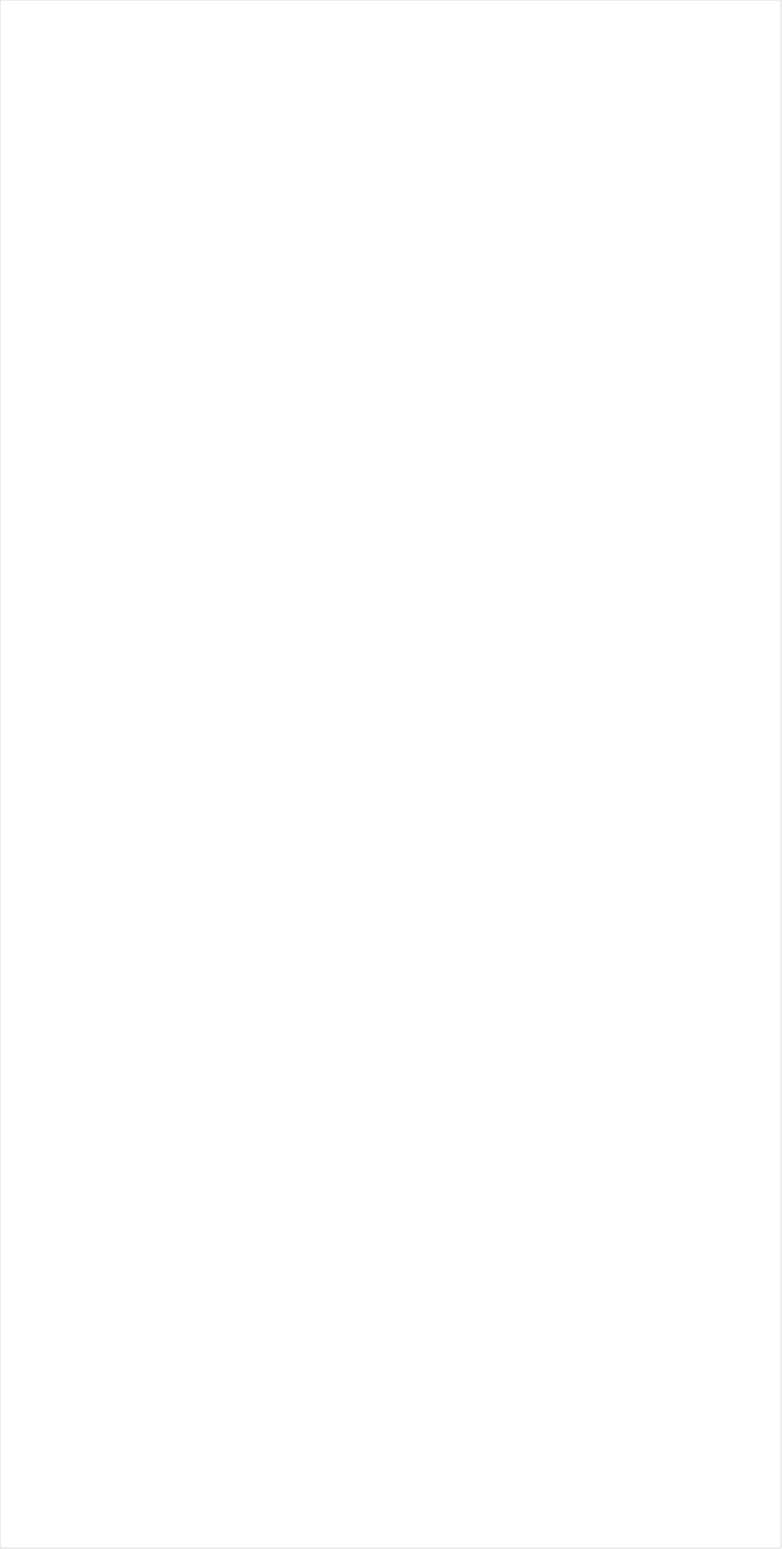
| Category | Total |
|---|---|
| INSP | -0.171 |
| PBS | -0.171 |
| RFD TV | -0.168 |
| Hallmark Movies & Mysteries | -0.166 |
| Tennis Channel | -0.152 |
| Fox Business | -0.124 |
| MSNBC | -0.121 |
| Hallmark | -0.107 |
| Outdoor Channel | -0.096 |
| Fox News | -0.092 |
| Weather Channel | -0.086 |
| UP TV | -0.079 |
| SundanceTV | -0.078 |
| Smithsonian | -0.078 |
| Great American Country | -0.067 |
| Bloomberg HD | -0.067 |
| WGN America | -0.066 |
| CBS | -0.065 |
| MyNetworkTV | -0.064 |
| NBC Sports | -0.064 |
| National Geographic Wild | -0.06 |
| TV LAND | -0.049 |
| ION | -0.049 |
| Discovery Life Channel | -0.039 |
| NBC | -0.039 |
| Golf | -0.037 |
| The Sportsman Channel | -0.036 |
| American Heroes Channel | -0.034 |
| CNBC | -0.033 |
| Olympic Channel | -0.031 |
| CNN | -0.028 |
| ABC | -0.026 |
| HGTV | -0.026 |
| Science Channel | -0.025 |
| FOX Sports 2 | -0.022 |
| History Channel | -0.021 |
| Game Show | -0.019 |
| DIY | -0.018 |
| Big Ten Network | -0.017 |
| Animal Planet | -0.017 |
| POP | -0.014 |
| Headline News | -0.011 |
| OXYGEN | -0.011 |
| Motor Trend Network | -0.001 |
| Ovation | 0.001 |
| FOX | 0.003 |
| CW | 0.004 |
| Lifetime Movies | 0.009 |
| Disney Junior US | 0.01 |
| Discovery Family Channel | 0.01 |
| FX Movie Channel | 0.014 |
| CMTV | 0.016 |
| TLC | 0.016 |
| FYI | 0.017 |
| Nick Jr. | 0.019 |
| Investigation Discovery | 0.019 |
| National Geographic | 0.019 |
| Food Network | 0.021 |
| WE TV | 0.024 |
| Travel | 0.026 |
| FXDEP | 0.026 |
| Discovery Channel | 0.027 |
| NBC Universo | 0.028 |
| USA Network | 0.029 |
| Oprah Winfrey Network | 0.029 |
| CBS Sports | 0.03 |
| SYFY | 0.031 |
| TUDN | 0.032 |
| Lifetime | 0.033 |
| Adult Swim | 0.036 |
| Logo | 0.037 |
| TBS | 0.037 |
| Paramount Network | 0.037 |
| Univision | 0.038 |
| A&E | 0.038 |
| E! | 0.039 |
| Fox Sports 1 | 0.04 |
| NFL Network | 0.04 |
| Reelz Channel | 0.04 |
| Destination America | 0.042 |
| PAC-12 Network | 0.042 |
| BBC America | 0.043 |
| Freeform | 0.044 |
| Telemundo | 0.046 |
| Galavision | 0.046 |
| Cooking Channel | 0.046 |
| MTV2 | 0.046 |
| AMC | 0.046 |
| MLB Network | 0.05 |
| Universal Kids | 0.05 |
| TNT | 0.054 |
| Independent Film (IFC) | 0.054 |
| FXX | 0.057 |
| BRAVO | 0.062 |
| MTV | 0.068 |
| UniMas | 0.068 |
| ESPNEWS | 0.07 |
| NBA TV | 0.071 |
| FX | 0.073 |
| TV ONE | 0.075 |
| BET | 0.075 |
| ESPN | 0.076 |
| Comedy Central | 0.079 |
| NHL | 0.083 |
| ESPN2 | 0.087 |
| ESPN Deportes | 0.089 |
| Nick@Nite | 0.09 |
| Viceland | 0.093 |
| truTV | 0.094 |
| VH1 | 0.098 |
| Nick | 0.109 |
| ESPNU | 0.112 |
| BET Her | 0.121 |
| Disney XD | 0.124 |
| Nick Toons | 0.124 |
| Teen Nick | 0.135 |
| Disney Channel | 0.14 |
| Cartoon Network | 0.161 |